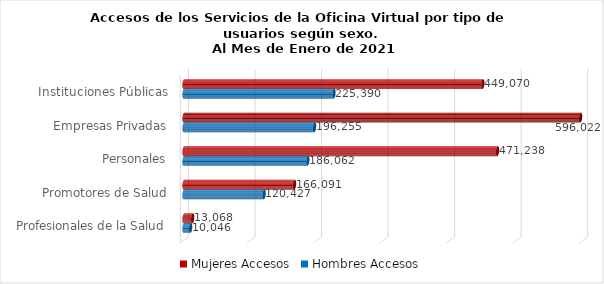
| Category | Mujeres | Hombres |
|---|---|---|
| Instituciones Públicas | 449070 | 225390 |
| Empresas Privadas | 596022 | 196255 |
| Personales | 471238 | 186062 |
| Promotores de Salud | 166091 | 120427 |
| Profesionales de la Salud | 13068 | 10046 |